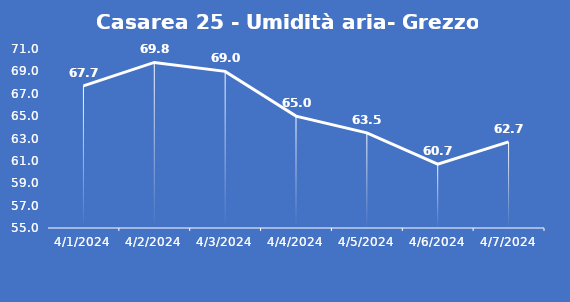
| Category | Casarea 25 - Umidità aria- Grezzo (%) |
|---|---|
| 4/1/24 | 67.7 |
| 4/2/24 | 69.8 |
| 4/3/24 | 69 |
| 4/4/24 | 65 |
| 4/5/24 | 63.5 |
| 4/6/24 | 60.7 |
| 4/7/24 | 62.7 |